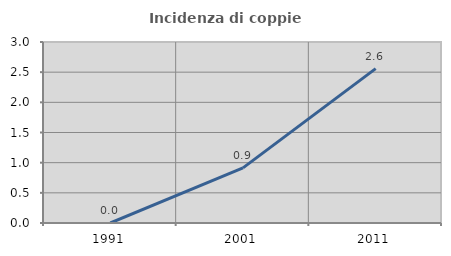
| Category | Incidenza di coppie miste |
|---|---|
| 1991.0 | 0 |
| 2001.0 | 0.913 |
| 2011.0 | 2.558 |